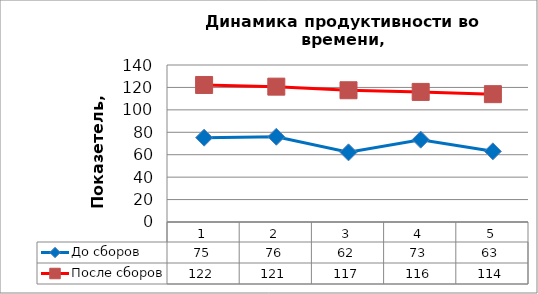
| Category | До сборов | После сборов |
|---|---|---|
| 0 | 75.214 | 122.182 |
| 1 | 76 | 120.69 |
| 2 | 62.125 | 117.481 |
| 3 | 73.412 | 116 |
| 4 | 63 | 114 |